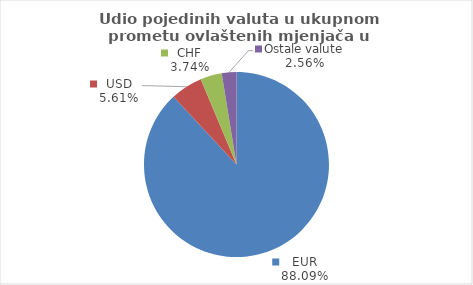
| Category | Series 0 |
|---|---|
| EUR | 88.085 |
| USD | 5.609 |
| CHF | 3.743 |
| Ostale valute | 2.563 |